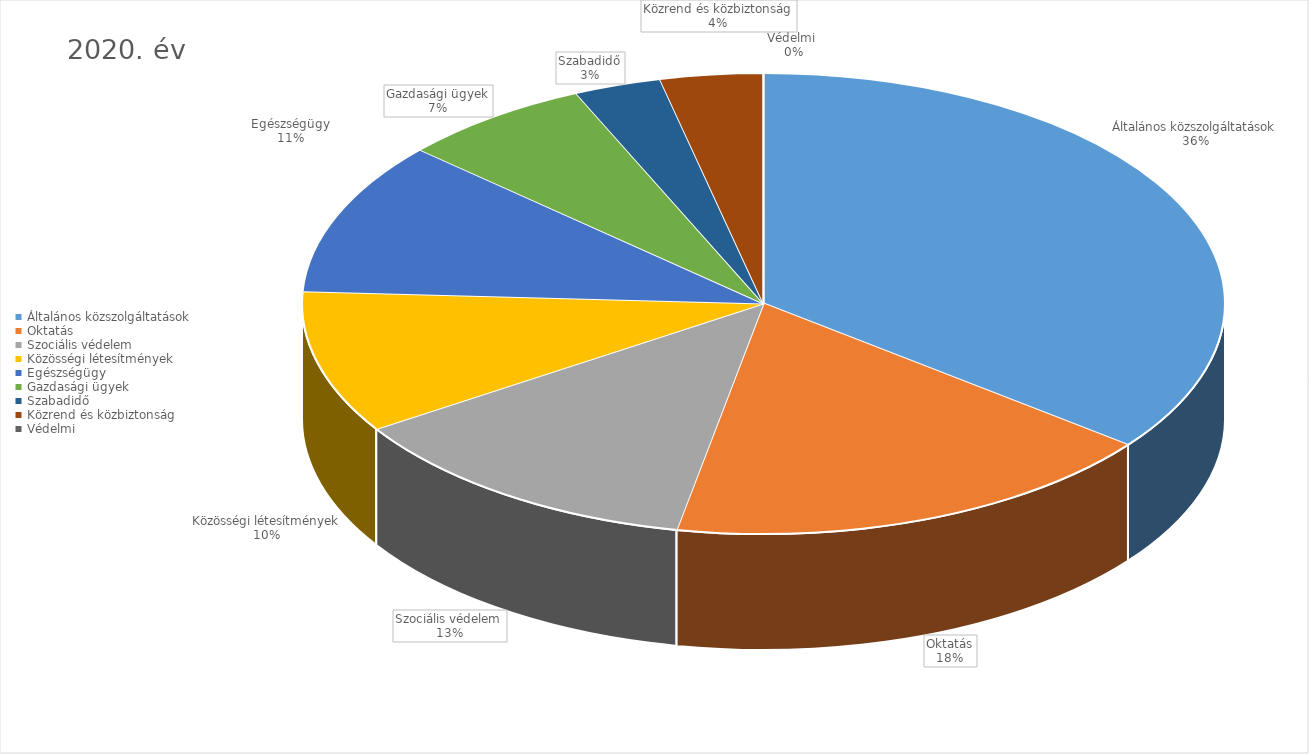
| Category | 2020. év |
|---|---|
| Általános közszolgáltatások | 11805387697 |
| Oktatás | 5818758493 |
| Szociális védelem | 4264639734 |
| Közösségi létesítmények | 3326137614 |
| Egészségügy | 3584580395 |
| Gazdasági ügyek | 2228702368 |
| Szabadidő | 1017032269 |
| Közrend és közbiztonság | 1197789178 |
| Védelmi  | 1195000 |